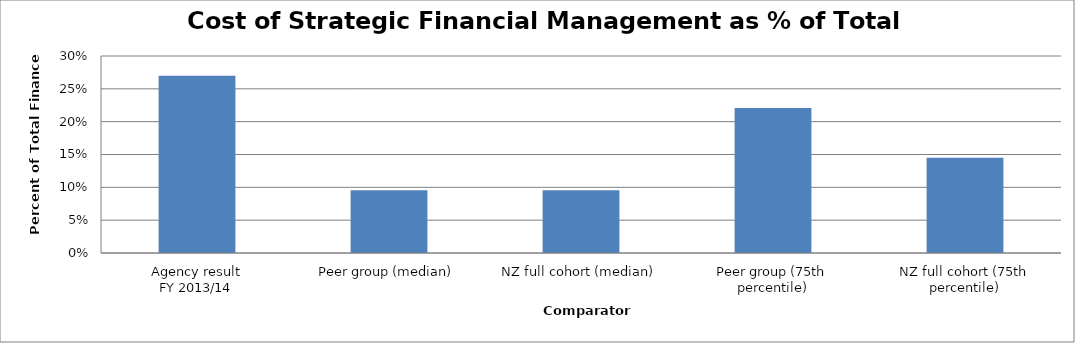
| Category | Result |
|---|---|
| Agency result
FY 2013/14 | 0.27 |
| Peer group (median) | 0.096 |
| NZ full cohort (median) | 0.096 |
| Peer group (75th percentile) | 0.221 |
| NZ full cohort (75th percentile) | 0.145 |